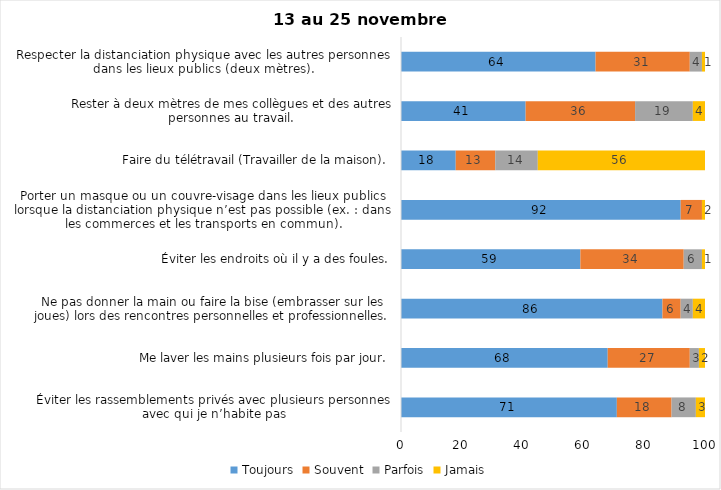
| Category | Toujours | Souvent | Parfois | Jamais |
|---|---|---|---|---|
| Éviter les rassemblements privés avec plusieurs personnes avec qui je n’habite pas | 71 | 18 | 8 | 3 |
| Me laver les mains plusieurs fois par jour. | 68 | 27 | 3 | 2 |
| Ne pas donner la main ou faire la bise (embrasser sur les joues) lors des rencontres personnelles et professionnelles. | 86 | 6 | 4 | 4 |
| Éviter les endroits où il y a des foules. | 59 | 34 | 6 | 1 |
| Porter un masque ou un couvre-visage dans les lieux publics lorsque la distanciation physique n’est pas possible (ex. : dans les commerces et les transports en commun). | 92 | 7 | 0 | 2 |
| Faire du télétravail (Travailler de la maison). | 18 | 13 | 14 | 56 |
| Rester à deux mètres de mes collègues et des autres personnes au travail. | 41 | 36 | 19 | 4 |
| Respecter la distanciation physique avec les autres personnes dans les lieux publics (deux mètres). | 64 | 31 | 4 | 1 |